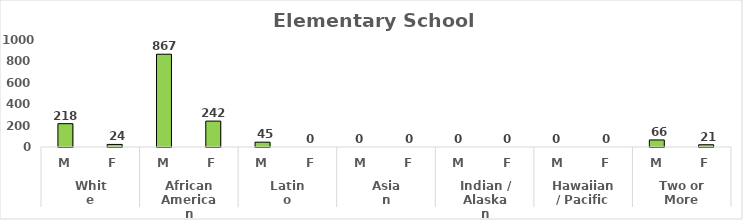
| Category | Series 0 |
|---|---|
| 0 | 218 |
| 1 | 24 |
| 2 | 867 |
| 3 | 242 |
| 4 | 45 |
| 5 | 0 |
| 6 | 0 |
| 7 | 0 |
| 8 | 0 |
| 9 | 0 |
| 10 | 0 |
| 11 | 0 |
| 12 | 66 |
| 13 | 21 |